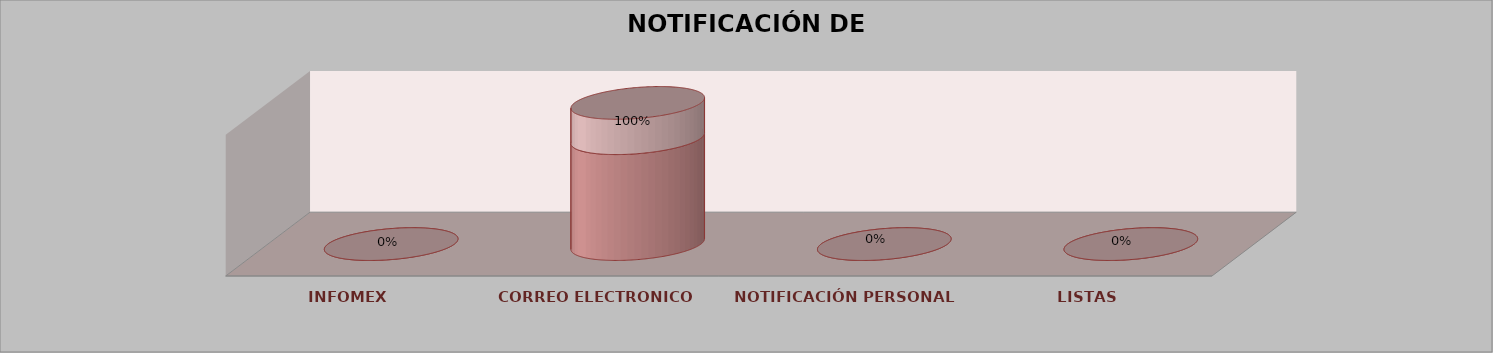
| Category | Series 0 | Series 1 | Series 2 | Series 3 | Series 4 |
|---|---|---|---|---|---|
| INFOMEX |  |  |  | 0 | 0 |
| CORREO ELECTRONICO |  |  |  | 3 | 1 |
| NOTIFICACIÓN PERSONAL |  |  |  | 0 | 0 |
| LISTAS |  |  |  | 0 | 0 |